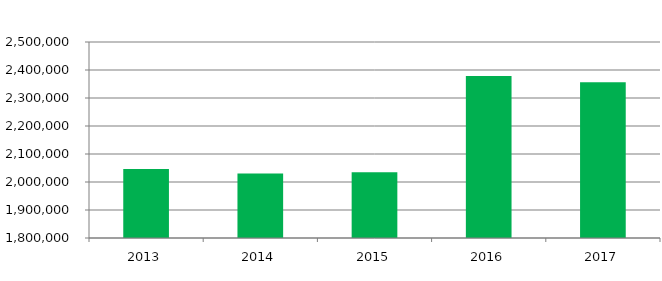
| Category |  Charges for Services  |
|---|---|
| 2013.0 | 2046548 |
| 2014.0 | 2030569 |
| 2015.0 | 2034569 |
| 2016.0 | 2378845 |
| 2017.0 | 2356483 |